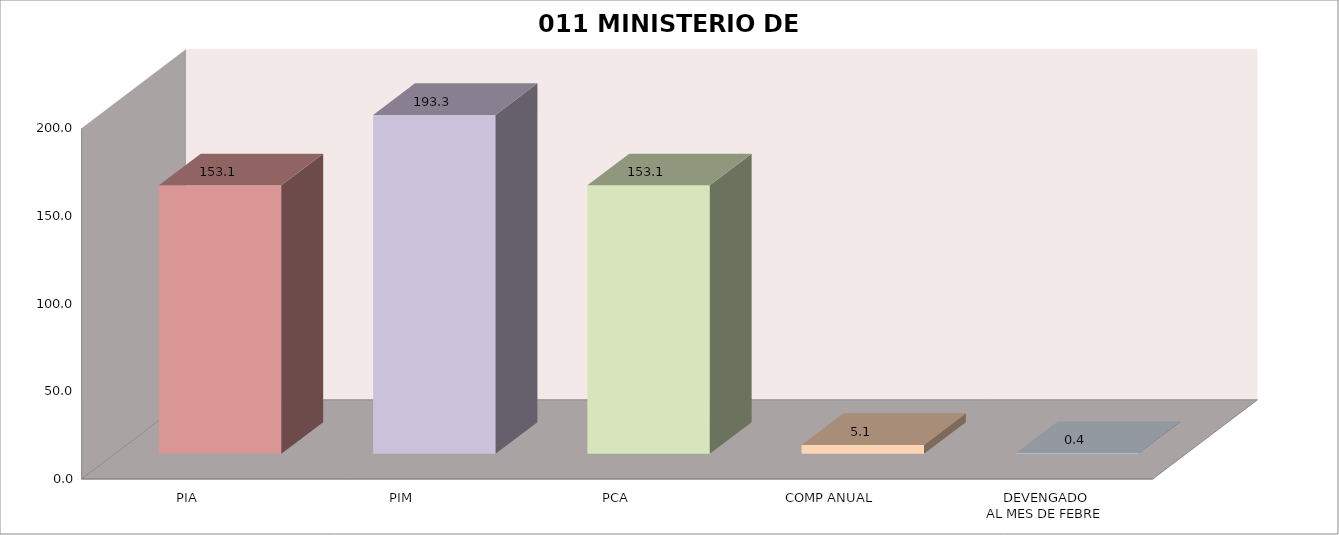
| Category | 011 MINISTERIO DE SALUD |
|---|---|
| PIA | 153.071 |
| PIM | 193.255 |
| PCA | 153.071 |
| COMP ANUAL | 5.065 |
| DEVENGADO
AL MES DE FEBRE | 0.365 |